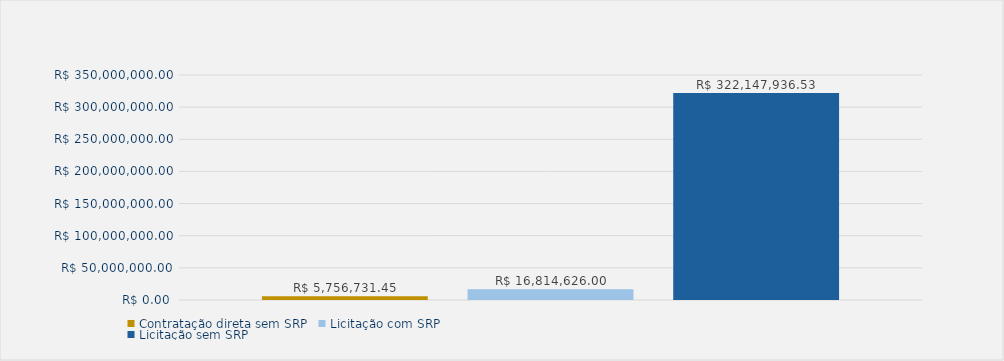
| Category | Contratação direta sem SRP | Licitação com SRP | Licitação sem SRP |
|---|---|---|---|
| Total | 5756731.45 | 16814626 | 322147936.53 |